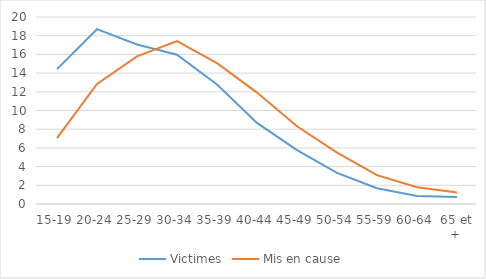
| Category | Victimes | Mis en cause |
|---|---|---|
| 15-19 | 14.426 | 7.044 |
| 20-24 | 18.696 | 12.834 |
| 25-29 | 17.054 | 15.793 |
| 30-34 | 15.968 | 17.417 |
| 35-39 | 12.784 | 15.069 |
| 40-44 | 8.679 | 11.917 |
| 45-49 | 5.76 | 8.315 |
| 50-54 | 3.322 | 5.5 |
| 55-59 | 1.693 | 3.088 |
| 60-64 | 0.859 | 1.801 |
| 65 et + | 0.758 | 1.222 |